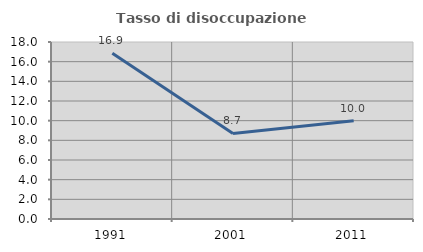
| Category | Tasso di disoccupazione giovanile  |
|---|---|
| 1991.0 | 16.854 |
| 2001.0 | 8.696 |
| 2011.0 | 10 |